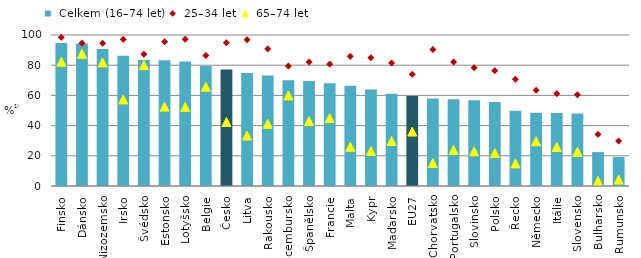
| Category |  Celkem (16–74 let) |
|---|---|
| Finsko | 94.679 |
| Dánsko | 94.351 |
| Nizozemsko | 90.718 |
| Irsko | 86.287 |
| Švédsko | 83.505 |
| Estonsko | 83.359 |
| Lotyšsko | 82.455 |
| Belgie | 79.506 |
| Česko | 77.094 |
| Litva | 74.818 |
| Rakousko | 73.127 |
| Lucembursko | 69.96 |
| Španělsko | 69.602 |
| Francie | 68.094 |
| Malta | 66.318 |
| Kypr | 63.943 |
| Maďarsko | 61.045 |
| EU27 | 59.68 |
| Chorvatsko | 57.958 |
| Portugalsko | 57.447 |
| Slovinsko | 56.856 |
| Polsko | 55.551 |
| Řecko | 49.779 |
| Německo | 48.576 |
| Itálie | 48.353 |
| Slovensko | 48.084 |
| Bulharsko | 22.438 |
| Rumunsko | 19.19 |